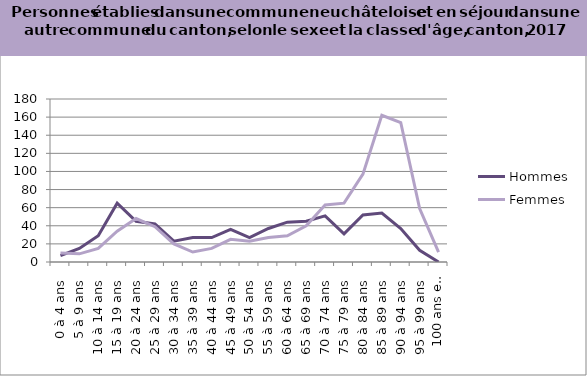
| Category | Hommes | Femmes |
|---|---|---|
| 0 à 4 ans | 7 | 10 |
| 5 à 9 ans | 15 | 9 |
| 10 à 14 ans | 29 | 15 |
| 15 à 19 ans | 65 | 34 |
| 20 à 24 ans | 45 | 48 |
| 25 à 29 ans | 42 | 39 |
| 30 à 34 ans | 23 | 20 |
| 35 à 39 ans | 27 | 11 |
| 40 à 44 ans | 27 | 15 |
| 45 à 49 ans | 36 | 25 |
| 50 à 54 ans | 27 | 23 |
| 55 à 59 ans | 37 | 27 |
| 60 à 64 ans | 44 | 29 |
| 65 à 69 ans | 45 | 40 |
| 70 à 74 ans | 51 | 63 |
| 75 à 79 ans | 31 | 65 |
| 80 à 84 ans | 52 | 97 |
| 85 à 89 ans | 54 | 162 |
| 90 à 94 ans | 37 | 154 |
| 95 à 99 ans | 13 | 59 |
| 100 ans et plus | 0 | 11 |